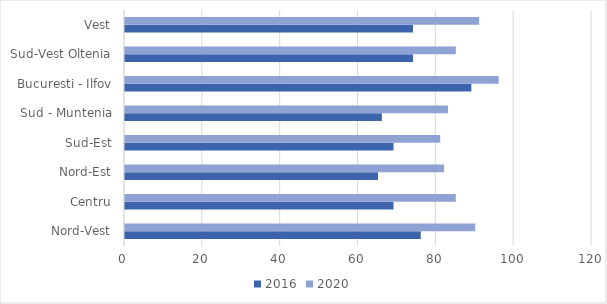
| Category | 2016 | 2020 |
|---|---|---|
| Nord-Vest | 76 | 90 |
| Centru | 69 | 85 |
| Nord-Est | 65 | 82 |
| Sud-Est | 69 | 81 |
| Sud - Muntenia | 66 | 83 |
| Bucuresti - Ilfov | 89 | 96 |
| Sud-Vest Oltenia | 74 | 85 |
| Vest | 74 | 91 |